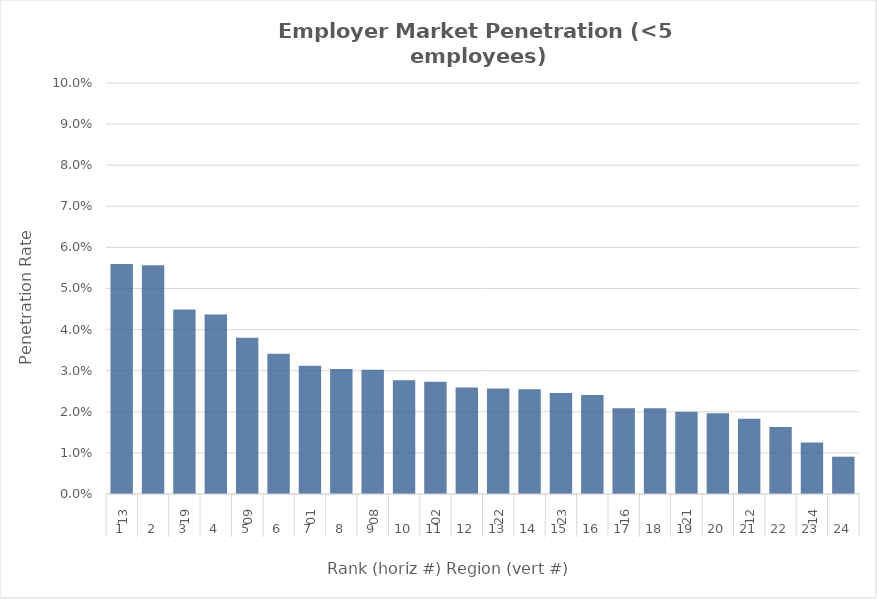
| Category | Rate |
|---|---|
| 0 | 0.056 |
| 1 | 0.056 |
| 2 | 0.045 |
| 3 | 0.044 |
| 4 | 0.038 |
| 5 | 0.034 |
| 6 | 0.031 |
| 7 | 0.03 |
| 8 | 0.03 |
| 9 | 0.028 |
| 10 | 0.027 |
| 11 | 0.026 |
| 12 | 0.026 |
| 13 | 0.025 |
| 14 | 0.025 |
| 15 | 0.024 |
| 16 | 0.021 |
| 17 | 0.021 |
| 18 | 0.02 |
| 19 | 0.02 |
| 20 | 0.018 |
| 21 | 0.016 |
| 22 | 0.013 |
| 23 | 0.009 |